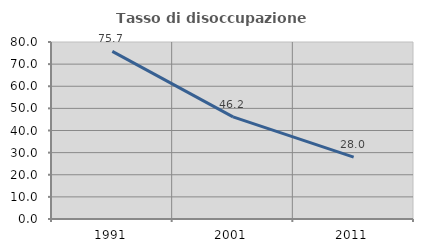
| Category | Tasso di disoccupazione giovanile  |
|---|---|
| 1991.0 | 75.745 |
| 2001.0 | 46.154 |
| 2011.0 | 28 |